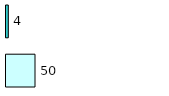
| Category | Series 0 | Series 1 |
|---|---|---|
| 0 | 50 | 4 |